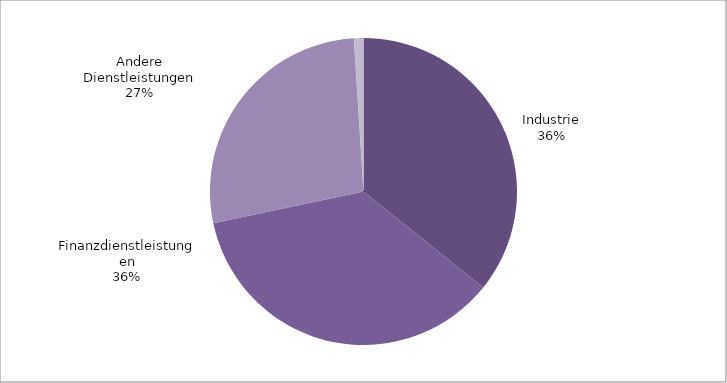
| Category | Series 0 |
|---|---|
| Industrie | 0.358 |
| Finanzdienstleistungen | 0.359 |
| Andere Dienstleistungen | 0.273 |
| Keine Angabe zum Wirtschaftszweig | 0.01 |